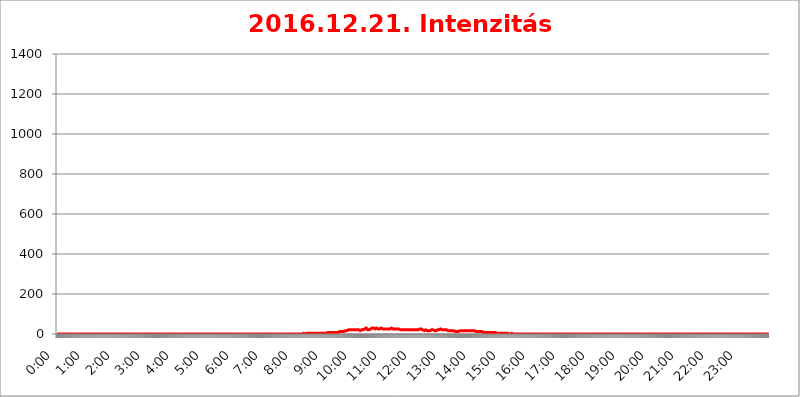
| Category | 2016.12.21. Intenzitás [W/m^2] |
|---|---|
| 0.0 | 0 |
| 0.0006944444444444445 | 0 |
| 0.001388888888888889 | 0 |
| 0.0020833333333333333 | 0 |
| 0.002777777777777778 | 0 |
| 0.003472222222222222 | 0 |
| 0.004166666666666667 | 0 |
| 0.004861111111111111 | 0 |
| 0.005555555555555556 | 0 |
| 0.0062499999999999995 | 0 |
| 0.006944444444444444 | 0 |
| 0.007638888888888889 | 0 |
| 0.008333333333333333 | 0 |
| 0.009027777777777779 | 0 |
| 0.009722222222222222 | 0 |
| 0.010416666666666666 | 0 |
| 0.011111111111111112 | 0 |
| 0.011805555555555555 | 0 |
| 0.012499999999999999 | 0 |
| 0.013194444444444444 | 0 |
| 0.013888888888888888 | 0 |
| 0.014583333333333332 | 0 |
| 0.015277777777777777 | 0 |
| 0.015972222222222224 | 0 |
| 0.016666666666666666 | 0 |
| 0.017361111111111112 | 0 |
| 0.018055555555555557 | 0 |
| 0.01875 | 0 |
| 0.019444444444444445 | 0 |
| 0.02013888888888889 | 0 |
| 0.020833333333333332 | 0 |
| 0.02152777777777778 | 0 |
| 0.022222222222222223 | 0 |
| 0.02291666666666667 | 0 |
| 0.02361111111111111 | 0 |
| 0.024305555555555556 | 0 |
| 0.024999999999999998 | 0 |
| 0.025694444444444447 | 0 |
| 0.02638888888888889 | 0 |
| 0.027083333333333334 | 0 |
| 0.027777777777777776 | 0 |
| 0.02847222222222222 | 0 |
| 0.029166666666666664 | 0 |
| 0.029861111111111113 | 0 |
| 0.030555555555555555 | 0 |
| 0.03125 | 0 |
| 0.03194444444444445 | 0 |
| 0.03263888888888889 | 0 |
| 0.03333333333333333 | 0 |
| 0.034027777777777775 | 0 |
| 0.034722222222222224 | 0 |
| 0.035416666666666666 | 0 |
| 0.036111111111111115 | 0 |
| 0.03680555555555556 | 0 |
| 0.0375 | 0 |
| 0.03819444444444444 | 0 |
| 0.03888888888888889 | 0 |
| 0.03958333333333333 | 0 |
| 0.04027777777777778 | 0 |
| 0.04097222222222222 | 0 |
| 0.041666666666666664 | 0 |
| 0.042361111111111106 | 0 |
| 0.04305555555555556 | 0 |
| 0.043750000000000004 | 0 |
| 0.044444444444444446 | 0 |
| 0.04513888888888889 | 0 |
| 0.04583333333333334 | 0 |
| 0.04652777777777778 | 0 |
| 0.04722222222222222 | 0 |
| 0.04791666666666666 | 0 |
| 0.04861111111111111 | 0 |
| 0.049305555555555554 | 0 |
| 0.049999999999999996 | 0 |
| 0.05069444444444445 | 0 |
| 0.051388888888888894 | 0 |
| 0.052083333333333336 | 0 |
| 0.05277777777777778 | 0 |
| 0.05347222222222222 | 0 |
| 0.05416666666666667 | 0 |
| 0.05486111111111111 | 0 |
| 0.05555555555555555 | 0 |
| 0.05625 | 0 |
| 0.05694444444444444 | 0 |
| 0.057638888888888885 | 0 |
| 0.05833333333333333 | 0 |
| 0.05902777777777778 | 0 |
| 0.059722222222222225 | 0 |
| 0.06041666666666667 | 0 |
| 0.061111111111111116 | 0 |
| 0.06180555555555556 | 0 |
| 0.0625 | 0 |
| 0.06319444444444444 | 0 |
| 0.06388888888888888 | 0 |
| 0.06458333333333334 | 0 |
| 0.06527777777777778 | 0 |
| 0.06597222222222222 | 0 |
| 0.06666666666666667 | 0 |
| 0.06736111111111111 | 0 |
| 0.06805555555555555 | 0 |
| 0.06874999999999999 | 0 |
| 0.06944444444444443 | 0 |
| 0.07013888888888889 | 0 |
| 0.07083333333333333 | 0 |
| 0.07152777777777779 | 0 |
| 0.07222222222222223 | 0 |
| 0.07291666666666667 | 0 |
| 0.07361111111111111 | 0 |
| 0.07430555555555556 | 0 |
| 0.075 | 0 |
| 0.07569444444444444 | 0 |
| 0.0763888888888889 | 0 |
| 0.07708333333333334 | 0 |
| 0.07777777777777778 | 0 |
| 0.07847222222222222 | 0 |
| 0.07916666666666666 | 0 |
| 0.0798611111111111 | 0 |
| 0.08055555555555556 | 0 |
| 0.08125 | 0 |
| 0.08194444444444444 | 0 |
| 0.08263888888888889 | 0 |
| 0.08333333333333333 | 0 |
| 0.08402777777777777 | 0 |
| 0.08472222222222221 | 0 |
| 0.08541666666666665 | 0 |
| 0.08611111111111112 | 0 |
| 0.08680555555555557 | 0 |
| 0.08750000000000001 | 0 |
| 0.08819444444444445 | 0 |
| 0.08888888888888889 | 0 |
| 0.08958333333333333 | 0 |
| 0.09027777777777778 | 0 |
| 0.09097222222222222 | 0 |
| 0.09166666666666667 | 0 |
| 0.09236111111111112 | 0 |
| 0.09305555555555556 | 0 |
| 0.09375 | 0 |
| 0.09444444444444444 | 0 |
| 0.09513888888888888 | 0 |
| 0.09583333333333333 | 0 |
| 0.09652777777777777 | 0 |
| 0.09722222222222222 | 0 |
| 0.09791666666666667 | 0 |
| 0.09861111111111111 | 0 |
| 0.09930555555555555 | 0 |
| 0.09999999999999999 | 0 |
| 0.10069444444444443 | 0 |
| 0.1013888888888889 | 0 |
| 0.10208333333333335 | 0 |
| 0.10277777777777779 | 0 |
| 0.10347222222222223 | 0 |
| 0.10416666666666667 | 0 |
| 0.10486111111111111 | 0 |
| 0.10555555555555556 | 0 |
| 0.10625 | 0 |
| 0.10694444444444444 | 0 |
| 0.1076388888888889 | 0 |
| 0.10833333333333334 | 0 |
| 0.10902777777777778 | 0 |
| 0.10972222222222222 | 0 |
| 0.1111111111111111 | 0 |
| 0.11180555555555556 | 0 |
| 0.11180555555555556 | 0 |
| 0.1125 | 0 |
| 0.11319444444444444 | 0 |
| 0.11388888888888889 | 0 |
| 0.11458333333333333 | 0 |
| 0.11527777777777777 | 0 |
| 0.11597222222222221 | 0 |
| 0.11666666666666665 | 0 |
| 0.1173611111111111 | 0 |
| 0.11805555555555557 | 0 |
| 0.11944444444444445 | 0 |
| 0.12013888888888889 | 0 |
| 0.12083333333333333 | 0 |
| 0.12152777777777778 | 0 |
| 0.12222222222222223 | 0 |
| 0.12291666666666667 | 0 |
| 0.12291666666666667 | 0 |
| 0.12361111111111112 | 0 |
| 0.12430555555555556 | 0 |
| 0.125 | 0 |
| 0.12569444444444444 | 0 |
| 0.12638888888888888 | 0 |
| 0.12708333333333333 | 0 |
| 0.16875 | 0 |
| 0.12847222222222224 | 0 |
| 0.12916666666666668 | 0 |
| 0.12986111111111112 | 0 |
| 0.13055555555555556 | 0 |
| 0.13125 | 0 |
| 0.13194444444444445 | 0 |
| 0.1326388888888889 | 0 |
| 0.13333333333333333 | 0 |
| 0.13402777777777777 | 0 |
| 0.13402777777777777 | 0 |
| 0.13472222222222222 | 0 |
| 0.13541666666666666 | 0 |
| 0.1361111111111111 | 0 |
| 0.13749999999999998 | 0 |
| 0.13819444444444443 | 0 |
| 0.1388888888888889 | 0 |
| 0.13958333333333334 | 0 |
| 0.14027777777777778 | 0 |
| 0.14097222222222222 | 0 |
| 0.14166666666666666 | 0 |
| 0.1423611111111111 | 0 |
| 0.14305555555555557 | 0 |
| 0.14375000000000002 | 0 |
| 0.14444444444444446 | 0 |
| 0.1451388888888889 | 0 |
| 0.1451388888888889 | 0 |
| 0.14652777777777778 | 0 |
| 0.14722222222222223 | 0 |
| 0.14791666666666667 | 0 |
| 0.1486111111111111 | 0 |
| 0.14930555555555555 | 0 |
| 0.15 | 0 |
| 0.15069444444444444 | 0 |
| 0.15138888888888888 | 0 |
| 0.15208333333333332 | 0 |
| 0.15277777777777776 | 0 |
| 0.15347222222222223 | 0 |
| 0.15416666666666667 | 0 |
| 0.15486111111111112 | 0 |
| 0.15555555555555556 | 0 |
| 0.15625 | 0 |
| 0.15694444444444444 | 0 |
| 0.15763888888888888 | 0 |
| 0.15833333333333333 | 0 |
| 0.15902777777777777 | 0 |
| 0.15972222222222224 | 0 |
| 0.16041666666666668 | 0 |
| 0.16111111111111112 | 0 |
| 0.16180555555555556 | 0 |
| 0.1625 | 0 |
| 0.16319444444444445 | 0 |
| 0.1638888888888889 | 0 |
| 0.16458333333333333 | 0 |
| 0.16527777777777777 | 0 |
| 0.16597222222222222 | 0 |
| 0.16666666666666666 | 0 |
| 0.1673611111111111 | 0 |
| 0.16805555555555554 | 0 |
| 0.16874999999999998 | 0 |
| 0.16944444444444443 | 0 |
| 0.17013888888888887 | 0 |
| 0.1708333333333333 | 0 |
| 0.17152777777777775 | 0 |
| 0.17222222222222225 | 0 |
| 0.1729166666666667 | 0 |
| 0.17361111111111113 | 0 |
| 0.17430555555555557 | 0 |
| 0.17500000000000002 | 0 |
| 0.17569444444444446 | 0 |
| 0.1763888888888889 | 0 |
| 0.17708333333333334 | 0 |
| 0.17777777777777778 | 0 |
| 0.17847222222222223 | 0 |
| 0.17916666666666667 | 0 |
| 0.1798611111111111 | 0 |
| 0.18055555555555555 | 0 |
| 0.18125 | 0 |
| 0.18194444444444444 | 0 |
| 0.1826388888888889 | 0 |
| 0.18333333333333335 | 0 |
| 0.1840277777777778 | 0 |
| 0.18472222222222223 | 0 |
| 0.18541666666666667 | 0 |
| 0.18611111111111112 | 0 |
| 0.18680555555555556 | 0 |
| 0.1875 | 0 |
| 0.18819444444444444 | 0 |
| 0.18888888888888888 | 0 |
| 0.18958333333333333 | 0 |
| 0.19027777777777777 | 0 |
| 0.1909722222222222 | 0 |
| 0.19166666666666665 | 0 |
| 0.19236111111111112 | 0 |
| 0.19305555555555554 | 0 |
| 0.19375 | 0 |
| 0.19444444444444445 | 0 |
| 0.1951388888888889 | 0 |
| 0.19583333333333333 | 0 |
| 0.19652777777777777 | 0 |
| 0.19722222222222222 | 0 |
| 0.19791666666666666 | 0 |
| 0.1986111111111111 | 0 |
| 0.19930555555555554 | 0 |
| 0.19999999999999998 | 0 |
| 0.20069444444444443 | 0 |
| 0.20138888888888887 | 0 |
| 0.2020833333333333 | 0 |
| 0.2027777777777778 | 0 |
| 0.2034722222222222 | 0 |
| 0.2041666666666667 | 0 |
| 0.20486111111111113 | 0 |
| 0.20555555555555557 | 0 |
| 0.20625000000000002 | 0 |
| 0.20694444444444446 | 0 |
| 0.2076388888888889 | 0 |
| 0.20833333333333334 | 0 |
| 0.20902777777777778 | 0 |
| 0.20972222222222223 | 0 |
| 0.21041666666666667 | 0 |
| 0.2111111111111111 | 0 |
| 0.21180555555555555 | 0 |
| 0.2125 | 0 |
| 0.21319444444444444 | 0 |
| 0.2138888888888889 | 0 |
| 0.21458333333333335 | 0 |
| 0.2152777777777778 | 0 |
| 0.21597222222222223 | 0 |
| 0.21666666666666667 | 0 |
| 0.21736111111111112 | 0 |
| 0.21805555555555556 | 0 |
| 0.21875 | 0 |
| 0.21944444444444444 | 0 |
| 0.22013888888888888 | 0 |
| 0.22083333333333333 | 0 |
| 0.22152777777777777 | 0 |
| 0.2222222222222222 | 0 |
| 0.22291666666666665 | 0 |
| 0.2236111111111111 | 0 |
| 0.22430555555555556 | 0 |
| 0.225 | 0 |
| 0.22569444444444445 | 0 |
| 0.2263888888888889 | 0 |
| 0.22708333333333333 | 0 |
| 0.22777777777777777 | 0 |
| 0.22847222222222222 | 0 |
| 0.22916666666666666 | 0 |
| 0.2298611111111111 | 0 |
| 0.23055555555555554 | 0 |
| 0.23124999999999998 | 0 |
| 0.23194444444444443 | 0 |
| 0.23263888888888887 | 0 |
| 0.2333333333333333 | 0 |
| 0.2340277777777778 | 0 |
| 0.2347222222222222 | 0 |
| 0.2354166666666667 | 0 |
| 0.23611111111111113 | 0 |
| 0.23680555555555557 | 0 |
| 0.23750000000000002 | 0 |
| 0.23819444444444446 | 0 |
| 0.2388888888888889 | 0 |
| 0.23958333333333334 | 0 |
| 0.24027777777777778 | 0 |
| 0.24097222222222223 | 0 |
| 0.24166666666666667 | 0 |
| 0.2423611111111111 | 0 |
| 0.24305555555555555 | 0 |
| 0.24375 | 0 |
| 0.24444444444444446 | 0 |
| 0.24513888888888888 | 0 |
| 0.24583333333333335 | 0 |
| 0.2465277777777778 | 0 |
| 0.24722222222222223 | 0 |
| 0.24791666666666667 | 0 |
| 0.24861111111111112 | 0 |
| 0.24930555555555556 | 0 |
| 0.25 | 0 |
| 0.25069444444444444 | 0 |
| 0.2513888888888889 | 0 |
| 0.2520833333333333 | 0 |
| 0.25277777777777777 | 0 |
| 0.2534722222222222 | 0 |
| 0.25416666666666665 | 0 |
| 0.2548611111111111 | 0 |
| 0.2555555555555556 | 0 |
| 0.25625000000000003 | 0 |
| 0.2569444444444445 | 0 |
| 0.2576388888888889 | 0 |
| 0.25833333333333336 | 0 |
| 0.2590277777777778 | 0 |
| 0.25972222222222224 | 0 |
| 0.2604166666666667 | 0 |
| 0.2611111111111111 | 0 |
| 0.26180555555555557 | 0 |
| 0.2625 | 0 |
| 0.26319444444444445 | 0 |
| 0.2638888888888889 | 0 |
| 0.26458333333333334 | 0 |
| 0.2652777777777778 | 0 |
| 0.2659722222222222 | 0 |
| 0.26666666666666666 | 0 |
| 0.2673611111111111 | 0 |
| 0.26805555555555555 | 0 |
| 0.26875 | 0 |
| 0.26944444444444443 | 0 |
| 0.2701388888888889 | 0 |
| 0.2708333333333333 | 0 |
| 0.27152777777777776 | 0 |
| 0.2722222222222222 | 0 |
| 0.27291666666666664 | 0 |
| 0.2736111111111111 | 0 |
| 0.2743055555555555 | 0 |
| 0.27499999999999997 | 0 |
| 0.27569444444444446 | 0 |
| 0.27638888888888885 | 0 |
| 0.27708333333333335 | 0 |
| 0.2777777777777778 | 0 |
| 0.27847222222222223 | 0 |
| 0.2791666666666667 | 0 |
| 0.2798611111111111 | 0 |
| 0.28055555555555556 | 0 |
| 0.28125 | 0 |
| 0.28194444444444444 | 0 |
| 0.2826388888888889 | 0 |
| 0.2833333333333333 | 0 |
| 0.28402777777777777 | 0 |
| 0.2847222222222222 | 0 |
| 0.28541666666666665 | 0 |
| 0.28611111111111115 | 0 |
| 0.28680555555555554 | 0 |
| 0.28750000000000003 | 0 |
| 0.2881944444444445 | 0 |
| 0.2888888888888889 | 0 |
| 0.28958333333333336 | 0 |
| 0.2902777777777778 | 0 |
| 0.29097222222222224 | 0 |
| 0.2916666666666667 | 0 |
| 0.2923611111111111 | 0 |
| 0.29305555555555557 | 0 |
| 0.29375 | 0 |
| 0.29444444444444445 | 0 |
| 0.2951388888888889 | 0 |
| 0.29583333333333334 | 0 |
| 0.2965277777777778 | 0 |
| 0.2972222222222222 | 0 |
| 0.29791666666666666 | 0 |
| 0.2986111111111111 | 0 |
| 0.29930555555555555 | 0 |
| 0.3 | 0 |
| 0.30069444444444443 | 0 |
| 0.3013888888888889 | 0 |
| 0.3020833333333333 | 0 |
| 0.30277777777777776 | 0 |
| 0.3034722222222222 | 0 |
| 0.30416666666666664 | 0 |
| 0.3048611111111111 | 0 |
| 0.3055555555555555 | 0 |
| 0.30624999999999997 | 0 |
| 0.3069444444444444 | 0 |
| 0.3076388888888889 | 0 |
| 0.30833333333333335 | 0 |
| 0.3090277777777778 | 0 |
| 0.30972222222222223 | 0 |
| 0.3104166666666667 | 0 |
| 0.3111111111111111 | 0 |
| 0.31180555555555556 | 0 |
| 0.3125 | 0 |
| 0.31319444444444444 | 0 |
| 0.3138888888888889 | 0 |
| 0.3145833333333333 | 0 |
| 0.31527777777777777 | 0 |
| 0.3159722222222222 | 0 |
| 0.31666666666666665 | 0 |
| 0.31736111111111115 | 0 |
| 0.31805555555555554 | 0 |
| 0.31875000000000003 | 0 |
| 0.3194444444444445 | 0 |
| 0.3201388888888889 | 0 |
| 0.32083333333333336 | 0 |
| 0.3215277777777778 | 0 |
| 0.32222222222222224 | 0 |
| 0.3229166666666667 | 0 |
| 0.3236111111111111 | 0 |
| 0.32430555555555557 | 0 |
| 0.325 | 0 |
| 0.32569444444444445 | 0 |
| 0.3263888888888889 | 0 |
| 0.32708333333333334 | 0 |
| 0.3277777777777778 | 0 |
| 0.3284722222222222 | 0 |
| 0.32916666666666666 | 0 |
| 0.3298611111111111 | 0 |
| 0.33055555555555555 | 0 |
| 0.33125 | 0 |
| 0.33194444444444443 | 0 |
| 0.3326388888888889 | 0 |
| 0.3333333333333333 | 0 |
| 0.3340277777777778 | 0 |
| 0.3347222222222222 | 0 |
| 0.3354166666666667 | 0 |
| 0.3361111111111111 | 0 |
| 0.3368055555555556 | 0 |
| 0.33749999999999997 | 0 |
| 0.33819444444444446 | 0 |
| 0.33888888888888885 | 0 |
| 0.33958333333333335 | 0 |
| 0.34027777777777773 | 0 |
| 0.34097222222222223 | 0 |
| 0.3416666666666666 | 0 |
| 0.3423611111111111 | 0 |
| 0.3430555555555555 | 0 |
| 0.34375 | 0 |
| 0.3444444444444445 | 3.525 |
| 0.3451388888888889 | 0 |
| 0.3458333333333334 | 3.525 |
| 0.34652777777777777 | 3.525 |
| 0.34722222222222227 | 0 |
| 0.34791666666666665 | 0 |
| 0.34861111111111115 | 3.525 |
| 0.34930555555555554 | 3.525 |
| 0.35000000000000003 | 3.525 |
| 0.3506944444444444 | 3.525 |
| 0.3513888888888889 | 3.525 |
| 0.3520833333333333 | 3.525 |
| 0.3527777777777778 | 3.525 |
| 0.3534722222222222 | 3.525 |
| 0.3541666666666667 | 3.525 |
| 0.3548611111111111 | 3.525 |
| 0.35555555555555557 | 3.525 |
| 0.35625 | 3.525 |
| 0.35694444444444445 | 3.525 |
| 0.3576388888888889 | 3.525 |
| 0.35833333333333334 | 3.525 |
| 0.3590277777777778 | 3.525 |
| 0.3597222222222222 | 3.525 |
| 0.36041666666666666 | 3.525 |
| 0.3611111111111111 | 3.525 |
| 0.36180555555555555 | 3.525 |
| 0.3625 | 3.525 |
| 0.36319444444444443 | 3.525 |
| 0.3638888888888889 | 3.525 |
| 0.3645833333333333 | 3.525 |
| 0.3652777777777778 | 3.525 |
| 0.3659722222222222 | 3.525 |
| 0.3666666666666667 | 3.525 |
| 0.3673611111111111 | 3.525 |
| 0.3680555555555556 | 3.525 |
| 0.36874999999999997 | 3.525 |
| 0.36944444444444446 | 3.525 |
| 0.37013888888888885 | 3.525 |
| 0.37083333333333335 | 3.525 |
| 0.37152777777777773 | 3.525 |
| 0.37222222222222223 | 3.525 |
| 0.3729166666666666 | 3.525 |
| 0.3736111111111111 | 3.525 |
| 0.3743055555555555 | 3.525 |
| 0.375 | 3.525 |
| 0.3756944444444445 | 3.525 |
| 0.3763888888888889 | 3.525 |
| 0.3770833333333334 | 3.525 |
| 0.37777777777777777 | 7.887 |
| 0.37847222222222227 | 7.887 |
| 0.37916666666666665 | 7.887 |
| 0.37986111111111115 | 7.887 |
| 0.38055555555555554 | 7.887 |
| 0.38125000000000003 | 7.887 |
| 0.3819444444444444 | 7.887 |
| 0.3826388888888889 | 7.887 |
| 0.3833333333333333 | 7.887 |
| 0.3840277777777778 | 7.887 |
| 0.3847222222222222 | 7.887 |
| 0.3854166666666667 | 7.887 |
| 0.3861111111111111 | 7.887 |
| 0.38680555555555557 | 7.887 |
| 0.3875 | 7.887 |
| 0.38819444444444445 | 7.887 |
| 0.3888888888888889 | 7.887 |
| 0.38958333333333334 | 7.887 |
| 0.3902777777777778 | 7.887 |
| 0.3909722222222222 | 7.887 |
| 0.39166666666666666 | 7.887 |
| 0.3923611111111111 | 7.887 |
| 0.39305555555555555 | 7.887 |
| 0.39375 | 7.887 |
| 0.39444444444444443 | 12.257 |
| 0.3951388888888889 | 12.257 |
| 0.3958333333333333 | 12.257 |
| 0.3965277777777778 | 12.257 |
| 0.3972222222222222 | 12.257 |
| 0.3979166666666667 | 12.257 |
| 0.3986111111111111 | 12.257 |
| 0.3993055555555556 | 12.257 |
| 0.39999999999999997 | 12.257 |
| 0.40069444444444446 | 12.257 |
| 0.40138888888888885 | 16.636 |
| 0.40208333333333335 | 12.257 |
| 0.40277777777777773 | 16.636 |
| 0.40347222222222223 | 16.636 |
| 0.4041666666666666 | 16.636 |
| 0.4048611111111111 | 16.636 |
| 0.4055555555555555 | 16.636 |
| 0.40625 | 16.636 |
| 0.4069444444444445 | 21.024 |
| 0.4076388888888889 | 21.024 |
| 0.4083333333333334 | 21.024 |
| 0.40902777777777777 | 21.024 |
| 0.40972222222222227 | 21.024 |
| 0.41041666666666665 | 21.024 |
| 0.41111111111111115 | 21.024 |
| 0.41180555555555554 | 21.024 |
| 0.41250000000000003 | 21.024 |
| 0.4131944444444444 | 21.024 |
| 0.4138888888888889 | 21.024 |
| 0.4145833333333333 | 21.024 |
| 0.4152777777777778 | 21.024 |
| 0.4159722222222222 | 21.024 |
| 0.4166666666666667 | 21.024 |
| 0.4173611111111111 | 21.024 |
| 0.41805555555555557 | 21.024 |
| 0.41875 | 21.024 |
| 0.41944444444444445 | 21.024 |
| 0.4201388888888889 | 21.024 |
| 0.42083333333333334 | 21.024 |
| 0.4215277777777778 | 21.024 |
| 0.4222222222222222 | 16.636 |
| 0.42291666666666666 | 21.024 |
| 0.4236111111111111 | 16.636 |
| 0.42430555555555555 | 16.636 |
| 0.425 | 16.636 |
| 0.42569444444444443 | 21.024 |
| 0.4263888888888889 | 21.024 |
| 0.4270833333333333 | 21.024 |
| 0.4277777777777778 | 21.024 |
| 0.4284722222222222 | 21.024 |
| 0.4291666666666667 | 21.024 |
| 0.4298611111111111 | 21.024 |
| 0.4305555555555556 | 25.419 |
| 0.43124999999999997 | 25.419 |
| 0.43194444444444446 | 25.419 |
| 0.43263888888888885 | 29.823 |
| 0.43333333333333335 | 29.823 |
| 0.43402777777777773 | 25.419 |
| 0.43472222222222223 | 25.419 |
| 0.4354166666666666 | 21.024 |
| 0.4361111111111111 | 21.024 |
| 0.4368055555555555 | 21.024 |
| 0.4375 | 21.024 |
| 0.4381944444444445 | 21.024 |
| 0.4388888888888889 | 25.419 |
| 0.4395833333333334 | 25.419 |
| 0.44027777777777777 | 25.419 |
| 0.44097222222222227 | 25.419 |
| 0.44166666666666665 | 29.823 |
| 0.44236111111111115 | 29.823 |
| 0.44305555555555554 | 25.419 |
| 0.44375000000000003 | 29.823 |
| 0.4444444444444444 | 25.419 |
| 0.4451388888888889 | 25.419 |
| 0.4458333333333333 | 25.419 |
| 0.4465277777777778 | 25.419 |
| 0.4472222222222222 | 29.823 |
| 0.4479166666666667 | 29.823 |
| 0.4486111111111111 | 25.419 |
| 0.44930555555555557 | 25.419 |
| 0.45 | 25.419 |
| 0.45069444444444445 | 25.419 |
| 0.4513888888888889 | 25.419 |
| 0.45208333333333334 | 25.419 |
| 0.4527777777777778 | 29.823 |
| 0.4534722222222222 | 25.419 |
| 0.45416666666666666 | 29.823 |
| 0.4548611111111111 | 29.823 |
| 0.45555555555555555 | 29.823 |
| 0.45625 | 25.419 |
| 0.45694444444444443 | 25.419 |
| 0.4576388888888889 | 25.419 |
| 0.4583333333333333 | 25.419 |
| 0.4590277777777778 | 25.419 |
| 0.4597222222222222 | 25.419 |
| 0.4604166666666667 | 25.419 |
| 0.4611111111111111 | 25.419 |
| 0.4618055555555556 | 25.419 |
| 0.46249999999999997 | 25.419 |
| 0.46319444444444446 | 25.419 |
| 0.46388888888888885 | 25.419 |
| 0.46458333333333335 | 25.419 |
| 0.46527777777777773 | 29.823 |
| 0.46597222222222223 | 29.823 |
| 0.4666666666666666 | 25.419 |
| 0.4673611111111111 | 25.419 |
| 0.4680555555555555 | 29.823 |
| 0.46875 | 29.823 |
| 0.4694444444444445 | 25.419 |
| 0.4701388888888889 | 25.419 |
| 0.4708333333333334 | 25.419 |
| 0.47152777777777777 | 25.419 |
| 0.47222222222222227 | 25.419 |
| 0.47291666666666665 | 25.419 |
| 0.47361111111111115 | 25.419 |
| 0.47430555555555554 | 25.419 |
| 0.47500000000000003 | 25.419 |
| 0.4756944444444444 | 25.419 |
| 0.4763888888888889 | 25.419 |
| 0.4770833333333333 | 25.419 |
| 0.4777777777777778 | 25.419 |
| 0.4784722222222222 | 25.419 |
| 0.4791666666666667 | 25.419 |
| 0.4798611111111111 | 25.419 |
| 0.48055555555555557 | 25.419 |
| 0.48125 | 21.024 |
| 0.48194444444444445 | 21.024 |
| 0.4826388888888889 | 21.024 |
| 0.48333333333333334 | 21.024 |
| 0.4840277777777778 | 21.024 |
| 0.4847222222222222 | 21.024 |
| 0.48541666666666666 | 21.024 |
| 0.4861111111111111 | 25.419 |
| 0.48680555555555555 | 21.024 |
| 0.4875 | 21.024 |
| 0.48819444444444443 | 21.024 |
| 0.4888888888888889 | 21.024 |
| 0.4895833333333333 | 21.024 |
| 0.4902777777777778 | 21.024 |
| 0.4909722222222222 | 25.419 |
| 0.4916666666666667 | 21.024 |
| 0.4923611111111111 | 21.024 |
| 0.4930555555555556 | 21.024 |
| 0.49374999999999997 | 21.024 |
| 0.49444444444444446 | 21.024 |
| 0.49513888888888885 | 21.024 |
| 0.49583333333333335 | 21.024 |
| 0.49652777777777773 | 21.024 |
| 0.49722222222222223 | 21.024 |
| 0.4979166666666666 | 21.024 |
| 0.4986111111111111 | 21.024 |
| 0.4993055555555555 | 21.024 |
| 0.5 | 21.024 |
| 0.5006944444444444 | 21.024 |
| 0.5013888888888889 | 25.419 |
| 0.5020833333333333 | 21.024 |
| 0.5027777777777778 | 21.024 |
| 0.5034722222222222 | 21.024 |
| 0.5041666666666667 | 21.024 |
| 0.5048611111111111 | 21.024 |
| 0.5055555555555555 | 21.024 |
| 0.50625 | 21.024 |
| 0.5069444444444444 | 21.024 |
| 0.5076388888888889 | 25.419 |
| 0.5083333333333333 | 25.419 |
| 0.5090277777777777 | 25.419 |
| 0.5097222222222222 | 25.419 |
| 0.5104166666666666 | 25.419 |
| 0.5111111111111112 | 25.419 |
| 0.5118055555555555 | 21.024 |
| 0.5125000000000001 | 21.024 |
| 0.5131944444444444 | 16.636 |
| 0.513888888888889 | 16.636 |
| 0.5145833333333333 | 16.636 |
| 0.5152777777777778 | 16.636 |
| 0.5159722222222222 | 21.024 |
| 0.5166666666666667 | 21.024 |
| 0.517361111111111 | 21.024 |
| 0.5180555555555556 | 16.636 |
| 0.5187499999999999 | 16.636 |
| 0.5194444444444445 | 16.636 |
| 0.5201388888888888 | 16.636 |
| 0.5208333333333334 | 16.636 |
| 0.5215277777777778 | 16.636 |
| 0.5222222222222223 | 16.636 |
| 0.5229166666666667 | 16.636 |
| 0.5236111111111111 | 21.024 |
| 0.5243055555555556 | 21.024 |
| 0.525 | 21.024 |
| 0.5256944444444445 | 25.419 |
| 0.5263888888888889 | 21.024 |
| 0.5270833333333333 | 21.024 |
| 0.5277777777777778 | 21.024 |
| 0.5284722222222222 | 16.636 |
| 0.5291666666666667 | 16.636 |
| 0.5298611111111111 | 16.636 |
| 0.5305555555555556 | 16.636 |
| 0.53125 | 16.636 |
| 0.5319444444444444 | 16.636 |
| 0.5326388888888889 | 21.024 |
| 0.5333333333333333 | 21.024 |
| 0.5340277777777778 | 21.024 |
| 0.5347222222222222 | 21.024 |
| 0.5354166666666667 | 21.024 |
| 0.5361111111111111 | 21.024 |
| 0.5368055555555555 | 21.024 |
| 0.5375 | 25.419 |
| 0.5381944444444444 | 25.419 |
| 0.5388888888888889 | 25.419 |
| 0.5395833333333333 | 21.024 |
| 0.5402777777777777 | 21.024 |
| 0.5409722222222222 | 21.024 |
| 0.5416666666666666 | 21.024 |
| 0.5423611111111112 | 21.024 |
| 0.5430555555555555 | 21.024 |
| 0.5437500000000001 | 21.024 |
| 0.5444444444444444 | 21.024 |
| 0.545138888888889 | 21.024 |
| 0.5458333333333333 | 21.024 |
| 0.5465277777777778 | 21.024 |
| 0.5472222222222222 | 16.636 |
| 0.5479166666666667 | 16.636 |
| 0.548611111111111 | 16.636 |
| 0.5493055555555556 | 21.024 |
| 0.5499999999999999 | 16.636 |
| 0.5506944444444445 | 16.636 |
| 0.5513888888888888 | 16.636 |
| 0.5520833333333334 | 16.636 |
| 0.5527777777777778 | 16.636 |
| 0.5534722222222223 | 16.636 |
| 0.5541666666666667 | 16.636 |
| 0.5548611111111111 | 16.636 |
| 0.5555555555555556 | 16.636 |
| 0.55625 | 16.636 |
| 0.5569444444444445 | 16.636 |
| 0.5576388888888889 | 16.636 |
| 0.5583333333333333 | 12.257 |
| 0.5590277777777778 | 12.257 |
| 0.5597222222222222 | 12.257 |
| 0.5604166666666667 | 12.257 |
| 0.5611111111111111 | 12.257 |
| 0.5618055555555556 | 12.257 |
| 0.5625 | 12.257 |
| 0.5631944444444444 | 12.257 |
| 0.5638888888888889 | 16.636 |
| 0.5645833333333333 | 16.636 |
| 0.5652777777777778 | 16.636 |
| 0.5659722222222222 | 16.636 |
| 0.5666666666666667 | 16.636 |
| 0.5673611111111111 | 16.636 |
| 0.5680555555555555 | 16.636 |
| 0.56875 | 16.636 |
| 0.5694444444444444 | 16.636 |
| 0.5701388888888889 | 16.636 |
| 0.5708333333333333 | 16.636 |
| 0.5715277777777777 | 16.636 |
| 0.5722222222222222 | 16.636 |
| 0.5729166666666666 | 16.636 |
| 0.5736111111111112 | 16.636 |
| 0.5743055555555555 | 16.636 |
| 0.5750000000000001 | 16.636 |
| 0.5756944444444444 | 16.636 |
| 0.576388888888889 | 16.636 |
| 0.5770833333333333 | 16.636 |
| 0.5777777777777778 | 16.636 |
| 0.5784722222222222 | 16.636 |
| 0.5791666666666667 | 16.636 |
| 0.579861111111111 | 16.636 |
| 0.5805555555555556 | 16.636 |
| 0.5812499999999999 | 16.636 |
| 0.5819444444444445 | 16.636 |
| 0.5826388888888888 | 16.636 |
| 0.5833333333333334 | 16.636 |
| 0.5840277777777778 | 16.636 |
| 0.5847222222222223 | 16.636 |
| 0.5854166666666667 | 16.636 |
| 0.5861111111111111 | 16.636 |
| 0.5868055555555556 | 16.636 |
| 0.5875 | 12.257 |
| 0.5881944444444445 | 12.257 |
| 0.5888888888888889 | 12.257 |
| 0.5895833333333333 | 12.257 |
| 0.5902777777777778 | 12.257 |
| 0.5909722222222222 | 12.257 |
| 0.5916666666666667 | 12.257 |
| 0.5923611111111111 | 12.257 |
| 0.5930555555555556 | 12.257 |
| 0.59375 | 12.257 |
| 0.5944444444444444 | 12.257 |
| 0.5951388888888889 | 12.257 |
| 0.5958333333333333 | 12.257 |
| 0.5965277777777778 | 12.257 |
| 0.5972222222222222 | 12.257 |
| 0.5979166666666667 | 7.887 |
| 0.5986111111111111 | 7.887 |
| 0.5993055555555555 | 7.887 |
| 0.6 | 7.887 |
| 0.6006944444444444 | 7.887 |
| 0.6013888888888889 | 7.887 |
| 0.6020833333333333 | 7.887 |
| 0.6027777777777777 | 7.887 |
| 0.6034722222222222 | 7.887 |
| 0.6041666666666666 | 7.887 |
| 0.6048611111111112 | 7.887 |
| 0.6055555555555555 | 7.887 |
| 0.6062500000000001 | 7.887 |
| 0.6069444444444444 | 7.887 |
| 0.607638888888889 | 7.887 |
| 0.6083333333333333 | 7.887 |
| 0.6090277777777778 | 7.887 |
| 0.6097222222222222 | 7.887 |
| 0.6104166666666667 | 7.887 |
| 0.611111111111111 | 7.887 |
| 0.6118055555555556 | 7.887 |
| 0.6124999999999999 | 7.887 |
| 0.6131944444444445 | 7.887 |
| 0.6138888888888888 | 7.887 |
| 0.6145833333333334 | 7.887 |
| 0.6152777777777778 | 3.525 |
| 0.6159722222222223 | 3.525 |
| 0.6166666666666667 | 3.525 |
| 0.6173611111111111 | 3.525 |
| 0.6180555555555556 | 3.525 |
| 0.61875 | 3.525 |
| 0.6194444444444445 | 3.525 |
| 0.6201388888888889 | 3.525 |
| 0.6208333333333333 | 3.525 |
| 0.6215277777777778 | 3.525 |
| 0.6222222222222222 | 3.525 |
| 0.6229166666666667 | 3.525 |
| 0.6236111111111111 | 3.525 |
| 0.6243055555555556 | 3.525 |
| 0.625 | 3.525 |
| 0.6256944444444444 | 3.525 |
| 0.6263888888888889 | 3.525 |
| 0.6270833333333333 | 3.525 |
| 0.6277777777777778 | 3.525 |
| 0.6284722222222222 | 3.525 |
| 0.6291666666666667 | 3.525 |
| 0.6298611111111111 | 3.525 |
| 0.6305555555555555 | 3.525 |
| 0.63125 | 3.525 |
| 0.6319444444444444 | 3.525 |
| 0.6326388888888889 | 3.525 |
| 0.6333333333333333 | 0 |
| 0.6340277777777777 | 3.525 |
| 0.6347222222222222 | 0 |
| 0.6354166666666666 | 0 |
| 0.6361111111111112 | 3.525 |
| 0.6368055555555555 | 3.525 |
| 0.6375000000000001 | 3.525 |
| 0.6381944444444444 | 0 |
| 0.638888888888889 | 0 |
| 0.6395833333333333 | 0 |
| 0.6402777777777778 | 0 |
| 0.6409722222222222 | 0 |
| 0.6416666666666667 | 0 |
| 0.642361111111111 | 0 |
| 0.6430555555555556 | 0 |
| 0.6437499999999999 | 0 |
| 0.6444444444444445 | 0 |
| 0.6451388888888888 | 0 |
| 0.6458333333333334 | 0 |
| 0.6465277777777778 | 0 |
| 0.6472222222222223 | 0 |
| 0.6479166666666667 | 0 |
| 0.6486111111111111 | 0 |
| 0.6493055555555556 | 0 |
| 0.65 | 0 |
| 0.6506944444444445 | 0 |
| 0.6513888888888889 | 0 |
| 0.6520833333333333 | 0 |
| 0.6527777777777778 | 0 |
| 0.6534722222222222 | 0 |
| 0.6541666666666667 | 0 |
| 0.6548611111111111 | 0 |
| 0.6555555555555556 | 0 |
| 0.65625 | 0 |
| 0.6569444444444444 | 0 |
| 0.6576388888888889 | 0 |
| 0.6583333333333333 | 0 |
| 0.6590277777777778 | 0 |
| 0.6597222222222222 | 0 |
| 0.6604166666666667 | 0 |
| 0.6611111111111111 | 0 |
| 0.6618055555555555 | 0 |
| 0.6625 | 0 |
| 0.6631944444444444 | 0 |
| 0.6638888888888889 | 0 |
| 0.6645833333333333 | 0 |
| 0.6652777777777777 | 0 |
| 0.6659722222222222 | 0 |
| 0.6666666666666666 | 0 |
| 0.6673611111111111 | 0 |
| 0.6680555555555556 | 0 |
| 0.6687500000000001 | 0 |
| 0.6694444444444444 | 0 |
| 0.6701388888888888 | 0 |
| 0.6708333333333334 | 0 |
| 0.6715277777777778 | 0 |
| 0.6722222222222222 | 0 |
| 0.6729166666666666 | 0 |
| 0.6736111111111112 | 0 |
| 0.6743055555555556 | 0 |
| 0.6749999999999999 | 0 |
| 0.6756944444444444 | 0 |
| 0.6763888888888889 | 0 |
| 0.6770833333333334 | 0 |
| 0.6777777777777777 | 0 |
| 0.6784722222222223 | 0 |
| 0.6791666666666667 | 0 |
| 0.6798611111111111 | 0 |
| 0.6805555555555555 | 0 |
| 0.68125 | 0 |
| 0.6819444444444445 | 0 |
| 0.6826388888888889 | 0 |
| 0.6833333333333332 | 0 |
| 0.6840277777777778 | 0 |
| 0.6847222222222222 | 0 |
| 0.6854166666666667 | 0 |
| 0.686111111111111 | 0 |
| 0.6868055555555556 | 0 |
| 0.6875 | 0 |
| 0.6881944444444444 | 0 |
| 0.688888888888889 | 0 |
| 0.6895833333333333 | 0 |
| 0.6902777777777778 | 0 |
| 0.6909722222222222 | 0 |
| 0.6916666666666668 | 0 |
| 0.6923611111111111 | 0 |
| 0.6930555555555555 | 0 |
| 0.69375 | 0 |
| 0.6944444444444445 | 0 |
| 0.6951388888888889 | 0 |
| 0.6958333333333333 | 0 |
| 0.6965277777777777 | 0 |
| 0.6972222222222223 | 0 |
| 0.6979166666666666 | 0 |
| 0.6986111111111111 | 0 |
| 0.6993055555555556 | 0 |
| 0.7000000000000001 | 0 |
| 0.7006944444444444 | 0 |
| 0.7013888888888888 | 0 |
| 0.7020833333333334 | 0 |
| 0.7027777777777778 | 0 |
| 0.7034722222222222 | 0 |
| 0.7041666666666666 | 0 |
| 0.7048611111111112 | 0 |
| 0.7055555555555556 | 0 |
| 0.7062499999999999 | 0 |
| 0.7069444444444444 | 0 |
| 0.7076388888888889 | 0 |
| 0.7083333333333334 | 0 |
| 0.7090277777777777 | 0 |
| 0.7097222222222223 | 0 |
| 0.7104166666666667 | 0 |
| 0.7111111111111111 | 0 |
| 0.7118055555555555 | 0 |
| 0.7125 | 0 |
| 0.7131944444444445 | 0 |
| 0.7138888888888889 | 0 |
| 0.7145833333333332 | 0 |
| 0.7152777777777778 | 0 |
| 0.7159722222222222 | 0 |
| 0.7166666666666667 | 0 |
| 0.717361111111111 | 0 |
| 0.7180555555555556 | 0 |
| 0.71875 | 0 |
| 0.7194444444444444 | 0 |
| 0.720138888888889 | 0 |
| 0.7208333333333333 | 0 |
| 0.7215277777777778 | 0 |
| 0.7222222222222222 | 0 |
| 0.7229166666666668 | 0 |
| 0.7236111111111111 | 0 |
| 0.7243055555555555 | 0 |
| 0.725 | 0 |
| 0.7256944444444445 | 0 |
| 0.7263888888888889 | 0 |
| 0.7270833333333333 | 0 |
| 0.7277777777777777 | 0 |
| 0.7284722222222223 | 0 |
| 0.7291666666666666 | 0 |
| 0.7298611111111111 | 0 |
| 0.7305555555555556 | 0 |
| 0.7312500000000001 | 0 |
| 0.7319444444444444 | 0 |
| 0.7326388888888888 | 0 |
| 0.7333333333333334 | 0 |
| 0.7340277777777778 | 0 |
| 0.7347222222222222 | 0 |
| 0.7354166666666666 | 0 |
| 0.7361111111111112 | 0 |
| 0.7368055555555556 | 0 |
| 0.7374999999999999 | 0 |
| 0.7381944444444444 | 0 |
| 0.7388888888888889 | 0 |
| 0.7395833333333334 | 0 |
| 0.7402777777777777 | 0 |
| 0.7409722222222223 | 0 |
| 0.7416666666666667 | 0 |
| 0.7423611111111111 | 0 |
| 0.7430555555555555 | 0 |
| 0.74375 | 0 |
| 0.7444444444444445 | 0 |
| 0.7451388888888889 | 0 |
| 0.7458333333333332 | 0 |
| 0.7465277777777778 | 0 |
| 0.7472222222222222 | 0 |
| 0.7479166666666667 | 0 |
| 0.748611111111111 | 0 |
| 0.7493055555555556 | 0 |
| 0.75 | 0 |
| 0.7506944444444444 | 0 |
| 0.751388888888889 | 0 |
| 0.7520833333333333 | 0 |
| 0.7527777777777778 | 0 |
| 0.7534722222222222 | 0 |
| 0.7541666666666668 | 0 |
| 0.7548611111111111 | 0 |
| 0.7555555555555555 | 0 |
| 0.75625 | 0 |
| 0.7569444444444445 | 0 |
| 0.7576388888888889 | 0 |
| 0.7583333333333333 | 0 |
| 0.7590277777777777 | 0 |
| 0.7597222222222223 | 0 |
| 0.7604166666666666 | 0 |
| 0.7611111111111111 | 0 |
| 0.7618055555555556 | 0 |
| 0.7625000000000001 | 0 |
| 0.7631944444444444 | 0 |
| 0.7638888888888888 | 0 |
| 0.7645833333333334 | 0 |
| 0.7652777777777778 | 0 |
| 0.7659722222222222 | 0 |
| 0.7666666666666666 | 0 |
| 0.7673611111111112 | 0 |
| 0.7680555555555556 | 0 |
| 0.7687499999999999 | 0 |
| 0.7694444444444444 | 0 |
| 0.7701388888888889 | 0 |
| 0.7708333333333334 | 0 |
| 0.7715277777777777 | 0 |
| 0.7722222222222223 | 0 |
| 0.7729166666666667 | 0 |
| 0.7736111111111111 | 0 |
| 0.7743055555555555 | 0 |
| 0.775 | 0 |
| 0.7756944444444445 | 0 |
| 0.7763888888888889 | 0 |
| 0.7770833333333332 | 0 |
| 0.7777777777777778 | 0 |
| 0.7784722222222222 | 0 |
| 0.7791666666666667 | 0 |
| 0.779861111111111 | 0 |
| 0.7805555555555556 | 0 |
| 0.78125 | 0 |
| 0.7819444444444444 | 0 |
| 0.782638888888889 | 0 |
| 0.7833333333333333 | 0 |
| 0.7840277777777778 | 0 |
| 0.7847222222222222 | 0 |
| 0.7854166666666668 | 0 |
| 0.7861111111111111 | 0 |
| 0.7868055555555555 | 0 |
| 0.7875 | 0 |
| 0.7881944444444445 | 0 |
| 0.7888888888888889 | 0 |
| 0.7895833333333333 | 0 |
| 0.7902777777777777 | 0 |
| 0.7909722222222223 | 0 |
| 0.7916666666666666 | 0 |
| 0.7923611111111111 | 0 |
| 0.7930555555555556 | 0 |
| 0.7937500000000001 | 0 |
| 0.7944444444444444 | 0 |
| 0.7951388888888888 | 0 |
| 0.7958333333333334 | 0 |
| 0.7965277777777778 | 0 |
| 0.7972222222222222 | 0 |
| 0.7979166666666666 | 0 |
| 0.7986111111111112 | 0 |
| 0.7993055555555556 | 0 |
| 0.7999999999999999 | 0 |
| 0.8006944444444444 | 0 |
| 0.8013888888888889 | 0 |
| 0.8020833333333334 | 0 |
| 0.8027777777777777 | 0 |
| 0.8034722222222223 | 0 |
| 0.8041666666666667 | 0 |
| 0.8048611111111111 | 0 |
| 0.8055555555555555 | 0 |
| 0.80625 | 0 |
| 0.8069444444444445 | 0 |
| 0.8076388888888889 | 0 |
| 0.8083333333333332 | 0 |
| 0.8090277777777778 | 0 |
| 0.8097222222222222 | 0 |
| 0.8104166666666667 | 0 |
| 0.811111111111111 | 0 |
| 0.8118055555555556 | 0 |
| 0.8125 | 0 |
| 0.8131944444444444 | 0 |
| 0.813888888888889 | 0 |
| 0.8145833333333333 | 0 |
| 0.8152777777777778 | 0 |
| 0.8159722222222222 | 0 |
| 0.8166666666666668 | 0 |
| 0.8173611111111111 | 0 |
| 0.8180555555555555 | 0 |
| 0.81875 | 0 |
| 0.8194444444444445 | 0 |
| 0.8201388888888889 | 0 |
| 0.8208333333333333 | 0 |
| 0.8215277777777777 | 0 |
| 0.8222222222222223 | 0 |
| 0.8229166666666666 | 0 |
| 0.8236111111111111 | 0 |
| 0.8243055555555556 | 0 |
| 0.8250000000000001 | 0 |
| 0.8256944444444444 | 0 |
| 0.8263888888888888 | 0 |
| 0.8270833333333334 | 0 |
| 0.8277777777777778 | 0 |
| 0.8284722222222222 | 0 |
| 0.8291666666666666 | 0 |
| 0.8298611111111112 | 0 |
| 0.8305555555555556 | 0 |
| 0.8312499999999999 | 0 |
| 0.8319444444444444 | 0 |
| 0.8326388888888889 | 0 |
| 0.8333333333333334 | 0 |
| 0.8340277777777777 | 0 |
| 0.8347222222222223 | 0 |
| 0.8354166666666667 | 0 |
| 0.8361111111111111 | 0 |
| 0.8368055555555555 | 0 |
| 0.8375 | 0 |
| 0.8381944444444445 | 0 |
| 0.8388888888888889 | 0 |
| 0.8395833333333332 | 0 |
| 0.8402777777777778 | 0 |
| 0.8409722222222222 | 0 |
| 0.8416666666666667 | 0 |
| 0.842361111111111 | 0 |
| 0.8430555555555556 | 0 |
| 0.84375 | 0 |
| 0.8444444444444444 | 0 |
| 0.845138888888889 | 0 |
| 0.8458333333333333 | 0 |
| 0.8465277777777778 | 0 |
| 0.8472222222222222 | 0 |
| 0.8479166666666668 | 0 |
| 0.8486111111111111 | 0 |
| 0.8493055555555555 | 0 |
| 0.85 | 0 |
| 0.8506944444444445 | 0 |
| 0.8513888888888889 | 0 |
| 0.8520833333333333 | 0 |
| 0.8527777777777777 | 0 |
| 0.8534722222222223 | 0 |
| 0.8541666666666666 | 0 |
| 0.8548611111111111 | 0 |
| 0.8555555555555556 | 0 |
| 0.8562500000000001 | 0 |
| 0.8569444444444444 | 0 |
| 0.8576388888888888 | 0 |
| 0.8583333333333334 | 0 |
| 0.8590277777777778 | 0 |
| 0.8597222222222222 | 0 |
| 0.8604166666666666 | 0 |
| 0.8611111111111112 | 0 |
| 0.8618055555555556 | 0 |
| 0.8624999999999999 | 0 |
| 0.8631944444444444 | 0 |
| 0.8638888888888889 | 0 |
| 0.8645833333333334 | 0 |
| 0.8652777777777777 | 0 |
| 0.8659722222222223 | 0 |
| 0.8666666666666667 | 0 |
| 0.8673611111111111 | 0 |
| 0.8680555555555555 | 0 |
| 0.86875 | 0 |
| 0.8694444444444445 | 0 |
| 0.8701388888888889 | 0 |
| 0.8708333333333332 | 0 |
| 0.8715277777777778 | 0 |
| 0.8722222222222222 | 0 |
| 0.8729166666666667 | 0 |
| 0.873611111111111 | 0 |
| 0.8743055555555556 | 0 |
| 0.875 | 0 |
| 0.8756944444444444 | 0 |
| 0.876388888888889 | 0 |
| 0.8770833333333333 | 0 |
| 0.8777777777777778 | 0 |
| 0.8784722222222222 | 0 |
| 0.8791666666666668 | 0 |
| 0.8798611111111111 | 0 |
| 0.8805555555555555 | 0 |
| 0.88125 | 0 |
| 0.8819444444444445 | 0 |
| 0.8826388888888889 | 0 |
| 0.8833333333333333 | 0 |
| 0.8840277777777777 | 0 |
| 0.8847222222222223 | 0 |
| 0.8854166666666666 | 0 |
| 0.8861111111111111 | 0 |
| 0.8868055555555556 | 0 |
| 0.8875000000000001 | 0 |
| 0.8881944444444444 | 0 |
| 0.8888888888888888 | 0 |
| 0.8895833333333334 | 0 |
| 0.8902777777777778 | 0 |
| 0.8909722222222222 | 0 |
| 0.8916666666666666 | 0 |
| 0.8923611111111112 | 0 |
| 0.8930555555555556 | 0 |
| 0.8937499999999999 | 0 |
| 0.8944444444444444 | 0 |
| 0.8951388888888889 | 0 |
| 0.8958333333333334 | 0 |
| 0.8965277777777777 | 0 |
| 0.8972222222222223 | 0 |
| 0.8979166666666667 | 0 |
| 0.8986111111111111 | 0 |
| 0.8993055555555555 | 0 |
| 0.9 | 0 |
| 0.9006944444444445 | 0 |
| 0.9013888888888889 | 0 |
| 0.9020833333333332 | 0 |
| 0.9027777777777778 | 0 |
| 0.9034722222222222 | 0 |
| 0.9041666666666667 | 0 |
| 0.904861111111111 | 0 |
| 0.9055555555555556 | 0 |
| 0.90625 | 0 |
| 0.9069444444444444 | 0 |
| 0.907638888888889 | 0 |
| 0.9083333333333333 | 0 |
| 0.9090277777777778 | 0 |
| 0.9097222222222222 | 0 |
| 0.9104166666666668 | 0 |
| 0.9111111111111111 | 0 |
| 0.9118055555555555 | 0 |
| 0.9125 | 0 |
| 0.9131944444444445 | 0 |
| 0.9138888888888889 | 0 |
| 0.9145833333333333 | 0 |
| 0.9152777777777777 | 0 |
| 0.9159722222222223 | 0 |
| 0.9166666666666666 | 0 |
| 0.9173611111111111 | 0 |
| 0.9180555555555556 | 0 |
| 0.9187500000000001 | 0 |
| 0.9194444444444444 | 0 |
| 0.9201388888888888 | 0 |
| 0.9208333333333334 | 0 |
| 0.9215277777777778 | 0 |
| 0.9222222222222222 | 0 |
| 0.9229166666666666 | 0 |
| 0.9236111111111112 | 0 |
| 0.9243055555555556 | 0 |
| 0.9249999999999999 | 0 |
| 0.9256944444444444 | 0 |
| 0.9263888888888889 | 0 |
| 0.9270833333333334 | 0 |
| 0.9277777777777777 | 0 |
| 0.9284722222222223 | 0 |
| 0.9291666666666667 | 0 |
| 0.9298611111111111 | 0 |
| 0.9305555555555555 | 0 |
| 0.93125 | 0 |
| 0.9319444444444445 | 0 |
| 0.9326388888888889 | 0 |
| 0.9333333333333332 | 0 |
| 0.9340277777777778 | 0 |
| 0.9347222222222222 | 0 |
| 0.9354166666666667 | 0 |
| 0.936111111111111 | 0 |
| 0.9368055555555556 | 0 |
| 0.9375 | 0 |
| 0.9381944444444444 | 0 |
| 0.938888888888889 | 0 |
| 0.9395833333333333 | 0 |
| 0.9402777777777778 | 0 |
| 0.9409722222222222 | 0 |
| 0.9416666666666668 | 0 |
| 0.9423611111111111 | 0 |
| 0.9430555555555555 | 0 |
| 0.94375 | 0 |
| 0.9444444444444445 | 0 |
| 0.9451388888888889 | 0 |
| 0.9458333333333333 | 0 |
| 0.9465277777777777 | 0 |
| 0.9472222222222223 | 0 |
| 0.9479166666666666 | 0 |
| 0.9486111111111111 | 0 |
| 0.9493055555555556 | 0 |
| 0.9500000000000001 | 0 |
| 0.9506944444444444 | 0 |
| 0.9513888888888888 | 0 |
| 0.9520833333333334 | 0 |
| 0.9527777777777778 | 0 |
| 0.9534722222222222 | 0 |
| 0.9541666666666666 | 0 |
| 0.9548611111111112 | 0 |
| 0.9555555555555556 | 0 |
| 0.9562499999999999 | 0 |
| 0.9569444444444444 | 0 |
| 0.9576388888888889 | 0 |
| 0.9583333333333334 | 0 |
| 0.9590277777777777 | 0 |
| 0.9597222222222223 | 0 |
| 0.9604166666666667 | 0 |
| 0.9611111111111111 | 0 |
| 0.9618055555555555 | 0 |
| 0.9625 | 0 |
| 0.9631944444444445 | 0 |
| 0.9638888888888889 | 0 |
| 0.9645833333333332 | 0 |
| 0.9652777777777778 | 0 |
| 0.9659722222222222 | 0 |
| 0.9666666666666667 | 0 |
| 0.967361111111111 | 0 |
| 0.9680555555555556 | 0 |
| 0.96875 | 0 |
| 0.9694444444444444 | 0 |
| 0.970138888888889 | 0 |
| 0.9708333333333333 | 0 |
| 0.9715277777777778 | 0 |
| 0.9722222222222222 | 0 |
| 0.9729166666666668 | 0 |
| 0.9736111111111111 | 0 |
| 0.9743055555555555 | 0 |
| 0.975 | 0 |
| 0.9756944444444445 | 0 |
| 0.9763888888888889 | 0 |
| 0.9770833333333333 | 0 |
| 0.9777777777777777 | 0 |
| 0.9784722222222223 | 0 |
| 0.9791666666666666 | 0 |
| 0.9798611111111111 | 0 |
| 0.9805555555555556 | 0 |
| 0.9812500000000001 | 0 |
| 0.9819444444444444 | 0 |
| 0.9826388888888888 | 0 |
| 0.9833333333333334 | 0 |
| 0.9840277777777778 | 0 |
| 0.9847222222222222 | 0 |
| 0.9854166666666666 | 0 |
| 0.9861111111111112 | 0 |
| 0.9868055555555556 | 0 |
| 0.9874999999999999 | 0 |
| 0.9881944444444444 | 0 |
| 0.9888888888888889 | 0 |
| 0.9895833333333334 | 0 |
| 0.9902777777777777 | 0 |
| 0.9909722222222223 | 0 |
| 0.9916666666666667 | 0 |
| 0.9923611111111111 | 0 |
| 0.9930555555555555 | 0 |
| 0.99375 | 0 |
| 0.9944444444444445 | 0 |
| 0.9951388888888889 | 0 |
| 0.9958333333333332 | 0 |
| 0.9965277777777778 | 0 |
| 0.9972222222222222 | 0 |
| 0.9979166666666667 | 0 |
| 0.998611111111111 | 0 |
| 0.9993055555555556 | 0 |